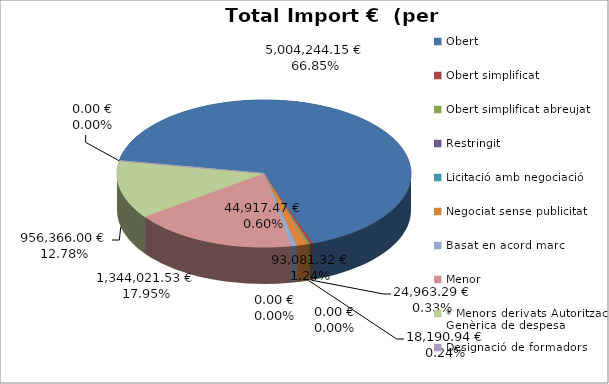
| Category | Total preu              (amb iva) |
|---|---|
| Obert | 5004244.15 |
| Obert simplificat | 24963.29 |
| Obert simplificat abreujat | 18190.94 |
| Restringit | 0 |
| Licitació amb negociació | 0 |
| Negociat sense publicitat | 93081.32 |
| Basat en acord marc | 44917.47 |
| Menor | 1344021.53 |
| * Menors derivats Autorització Genèrica de despesa | 956366 |
| Designació de formadors | 0 |